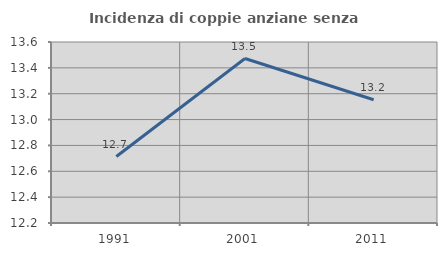
| Category | Incidenza di coppie anziane senza figli  |
|---|---|
| 1991.0 | 12.714 |
| 2001.0 | 13.472 |
| 2011.0 | 13.153 |